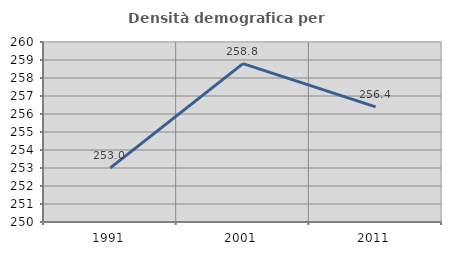
| Category | Densità demografica |
|---|---|
| 1991.0 | 253.005 |
| 2001.0 | 258.798 |
| 2011.0 | 256.392 |